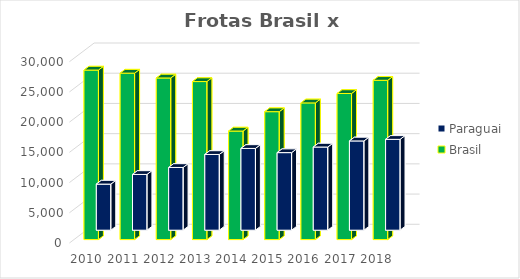
| Category | Paraguai | Brasil |
|---|---|---|
| 2010.0 | 7628 | 28048 |
| 2011.0 | 9229 | 27541 |
| 2012.0 | 10384 | 26740 |
| 2013.0 | 12534 | 26147 |
| 2014.0 | 13532 | 17957 |
| 2015.0 | 12838 | 21164 |
| 2016.0 | 13764 | 22616 |
| 2017.0 | 14771 | 24173 |
| 2018.0 | 15033 | 26355 |